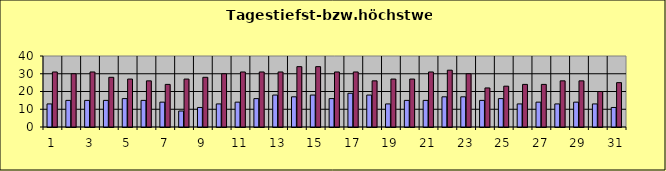
| Category | H-werte | t-werte |
|---|---|---|
| 0 | 13 | 31 |
| 1 | 15 | 30 |
| 2 | 15 | 31 |
| 3 | 15 | 28 |
| 4 | 16 | 27 |
| 5 | 15 | 26 |
| 6 | 14 | 24 |
| 7 | 9 | 27 |
| 8 | 11 | 28 |
| 9 | 13 | 30 |
| 10 | 14 | 31 |
| 11 | 16 | 31 |
| 12 | 18 | 31 |
| 13 | 17 | 34 |
| 14 | 18 | 34 |
| 15 | 16 | 31 |
| 16 | 19 | 31 |
| 17 | 18 | 26 |
| 18 | 13 | 27 |
| 19 | 15 | 27 |
| 20 | 15 | 31 |
| 21 | 17 | 32 |
| 22 | 17 | 30 |
| 23 | 15 | 22 |
| 24 | 16 | 23 |
| 25 | 13 | 24 |
| 26 | 14 | 24 |
| 27 | 13 | 26 |
| 28 | 14 | 26 |
| 29 | 13 | 20 |
| 30 | 11 | 25 |